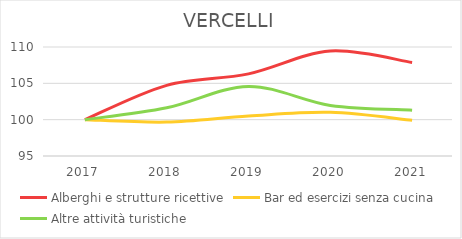
| Category | Alberghi e strutture ricettive | Bar ed esercizi senza cucina | Altre attività turistiche |
|---|---|---|---|
| 2017.0 | 100 | 100 | 100 |
| 2018.0 | 104.724 | 99.665 | 101.634 |
| 2019.0 | 106.299 | 100.502 | 104.575 |
| 2020.0 | 109.449 | 101.004 | 101.961 |
| 2021.0 | 107.874 | 99.916 | 101.307 |